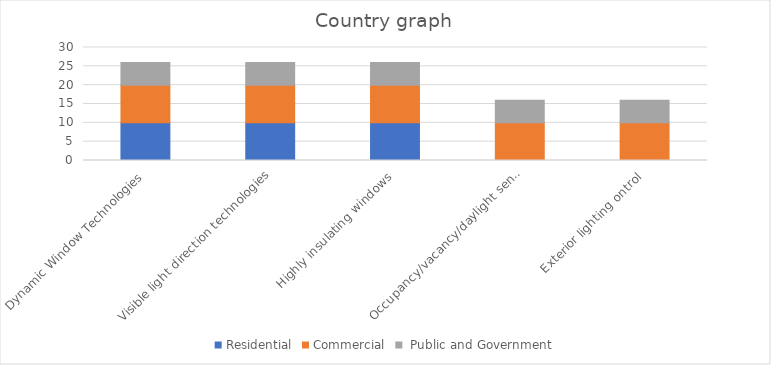
| Category | Residential | Commercial |  Public and Government |
|---|---|---|---|
| Dynamic Window Technologies | 10 | 10 | 6 |
| Visible light direction technologies | 10 | 10 | 6 |
| Highly insulating windows | 10 | 10 | 6 |
| Occupancy/vacancy/daylight sensors | 0 | 10 | 6 |
| Exterior lighting ontrol | 0 | 10 | 6 |